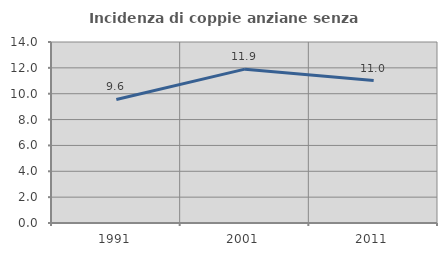
| Category | Incidenza di coppie anziane senza figli  |
|---|---|
| 1991.0 | 9.555 |
| 2001.0 | 11.901 |
| 2011.0 | 11.016 |